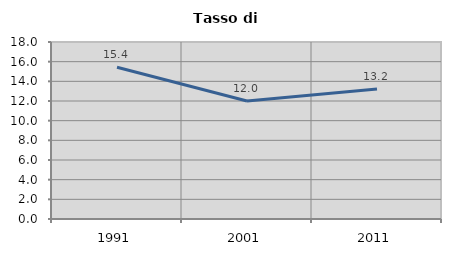
| Category | Tasso di disoccupazione   |
|---|---|
| 1991.0 | 15.432 |
| 2001.0 | 12 |
| 2011.0 | 13.215 |